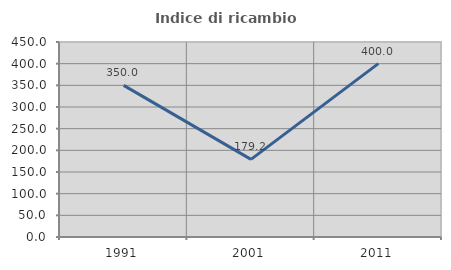
| Category | Indice di ricambio occupazionale  |
|---|---|
| 1991.0 | 350 |
| 2001.0 | 179.167 |
| 2011.0 | 400 |